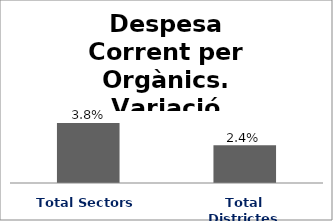
| Category | Series 0 |
|---|---|
| Total Sectors | 0.038 |
| Total Districtes | 0.024 |